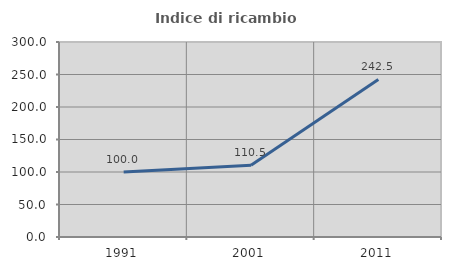
| Category | Indice di ricambio occupazionale  |
|---|---|
| 1991.0 | 100 |
| 2001.0 | 110.526 |
| 2011.0 | 242.466 |